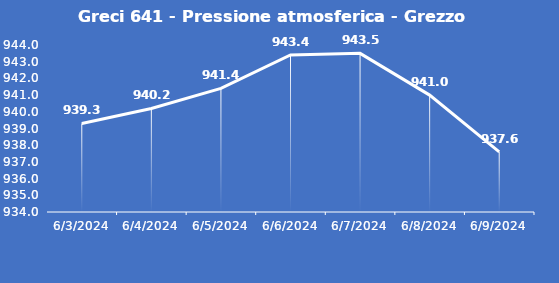
| Category | Greci 641 - Pressione atmosferica - Grezzo (hPa) |
|---|---|
| 6/3/24 | 939.3 |
| 6/4/24 | 940.2 |
| 6/5/24 | 941.4 |
| 6/6/24 | 943.4 |
| 6/7/24 | 943.5 |
| 6/8/24 | 941 |
| 6/9/24 | 937.6 |